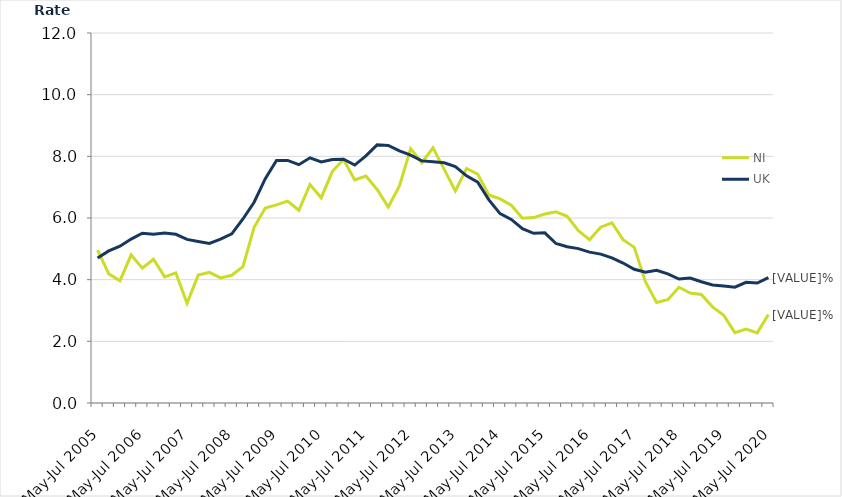
| Category | NI | UK |
|---|---|---|
| May-Jul 2005 | 4.958 | 4.702 |
| Aug-Oct 2005 | 4.188 | 4.932 |
| Nov-Jan 2006 | 3.962 | 5.087 |
| Feb-Apr 2006 | 4.807 | 5.316 |
| May-Jul 2006 | 4.372 | 5.506 |
| Aug-Oct 2006 | 4.661 | 5.476 |
| Nov-Jan 2007 | 4.09 | 5.51 |
| Feb-Apr 2007 | 4.22 | 5.472 |
| May-Jul 2007 | 3.233 | 5.306 |
| Aug-Oct 2007 | 4.148 | 5.239 |
| Nov-Jan 2008 | 4.239 | 5.177 |
| Feb-Apr 2008 | 4.056 | 5.314 |
| May-Jul 2008 | 4.143 | 5.487 |
| Aug-Oct 2008 | 4.424 | 5.968 |
| Nov-Jan 2009 | 5.7 | 6.511 |
| Feb-Apr 2009 | 6.323 | 7.274 |
| May-Jul 2009 | 6.424 | 7.868 |
| Aug-Oct 2009 | 6.545 | 7.868 |
| Nov-Jan 2010 | 6.251 | 7.729 |
| Feb-Apr 2010 | 7.087 | 7.952 |
| May-Jul 2010 | 6.654 | 7.82 |
| Aug-Oct 2010 | 7.514 | 7.897 |
| Nov-Jan 2011 | 7.898 | 7.909 |
| Feb-Apr 2011 | 7.236 | 7.717 |
| May-Jul 2011 | 7.361 | 8.013 |
| Aug-Oct 2011 | 6.925 | 8.372 |
| Nov-Jan 2012 | 6.356 | 8.352 |
| Feb-Apr 2012 | 7.038 | 8.174 |
| May-Jul 2012 | 8.249 | 8.038 |
| Aug-Oct 2012 | 7.794 | 7.852 |
| Nov-Jan 2013 | 8.276 | 7.822 |
| Feb-Apr 2013 | 7.576 | 7.792 |
| May-Jul 2013 | 6.879 | 7.671 |
| Aug-Oct 2013 | 7.607 | 7.369 |
| Nov-Jan 2014 | 7.42 | 7.162 |
| Feb-Apr 2014 | 6.746 | 6.588 |
| May-Jul 2014 | 6.618 | 6.143 |
| Aug-Oct 2014 | 6.416 | 5.955 |
| Nov-Jan 2015 | 5.994 | 5.655 |
| Feb-Apr 2015 | 6.014 | 5.504 |
| May-Jul 2015 | 6.128 | 5.519 |
| Aug-Oct 2015 | 6.2 | 5.174 |
| Nov-Jan 2016 | 6.056 | 5.069 |
| Feb-Apr 2016 | 5.592 | 5.007 |
| May-Jul 2016 | 5.294 | 4.894 |
| Aug-Oct 2016 | 5.703 | 4.829 |
| Nov-Jan 2017 | 5.845 | 4.707 |
| Feb-Apr 2017 | 5.298 | 4.54 |
| May-Jul 2017 | 5.048 | 4.338 |
| Aug-Oct 2017 | 3.937 | 4.243 |
| Nov-Jan 2018 | 3.262 | 4.306 |
| Feb-Apr 2018 | 3.349 | 4.189 |
| May-Jul 2018 | 3.754 | 4.021 |
| Aug-Oct 2018 | 3.564 | 4.055 |
| Nov-Jan 2019 | 3.521 | 3.931 |
| Feb-Apr 2019 | 3.119 | 3.83 |
| May-Jul 2019 | 2.844 | 3.797 |
| Aug-Oct 2019 | 2.281 | 3.757 |
| Nov-Jan 2020 | 2.398 | 3.913 |
| Feb-Apr 2020 | 2.275 | 3.891 |
| May-Jul 2020 | 2.868 | 4.065 |